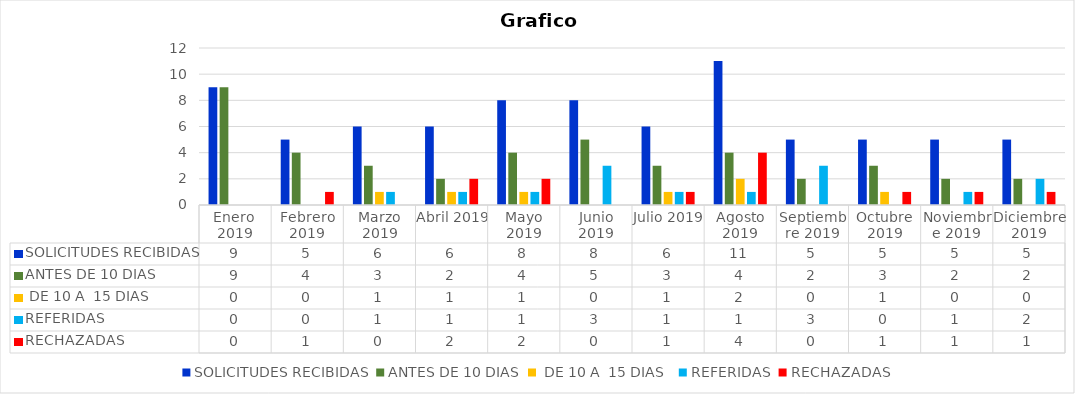
| Category | SOLICITUDES RECIBIDAS | ANTES DE 10 DIAS |  DE 10 A  15 DIAS  | REFERIDAS | RECHAZADAS |
|---|---|---|---|---|---|
| Enero  2019 | 9 | 9 | 0 | 0 | 0 |
| Febrero 2019 | 5 | 4 | 0 | 0 | 1 |
| Marzo 2019 | 6 | 3 | 1 | 1 | 0 |
| Abril 2019 | 6 | 2 | 1 | 1 | 2 |
| Mayo 2019 | 8 | 4 | 1 | 1 | 2 |
| Junio 2019 | 8 | 5 | 0 | 3 | 0 |
| Julio 2019 | 6 | 3 | 1 | 1 | 1 |
| Agosto 2019 | 11 | 4 | 2 | 1 | 4 |
| Septiembre 2019 | 5 | 2 | 0 | 3 | 0 |
| Octubre 2019 | 5 | 3 | 1 | 0 | 1 |
| Noviembre 2019 | 5 | 2 | 0 | 1 | 1 |
| Diciembre 2019 | 5 | 2 | 0 | 2 | 1 |